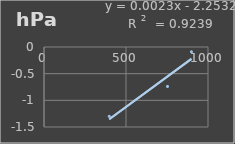
| Category | Presión Admosferica |
|---|---|
| 397.9 | -1.3 |
| 753.1 | -0.74 |
| 899.0 | -0.09 |